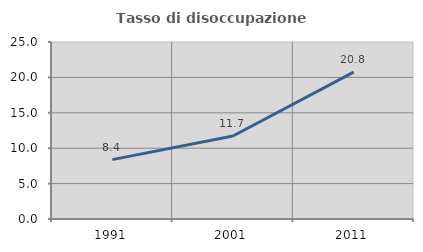
| Category | Tasso di disoccupazione giovanile  |
|---|---|
| 1991.0 | 8.387 |
| 2001.0 | 11.724 |
| 2011.0 | 20.755 |